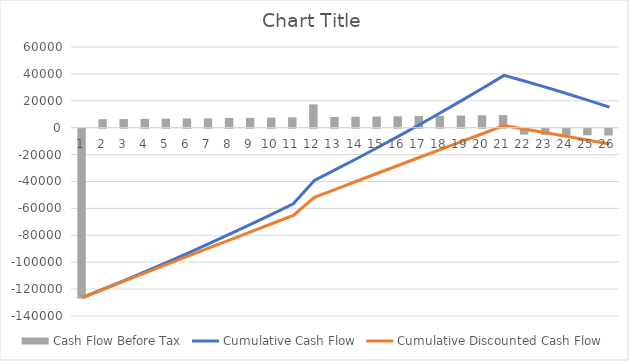
| Category | Cash Flow Before Tax |
|---|---|
| 0 | -126254.486 |
| 1 | 6322.417 |
| 2 | 6459.713 |
| 3 | 6599.611 |
| 4 | 6742.142 |
| 5 | 6887.338 |
| 6 | 7035.229 |
| 7 | 7185.846 |
| 8 | 7339.219 |
| 9 | 7495.374 |
| 10 | 7654.34 |
| 11 | 17345.469 |
| 12 | 7980.811 |
| 13 | 8148.365 |
| 14 | 8318.829 |
| 15 | 8492.224 |
| 16 | 8668.572 |
| 17 | 8847.89 |
| 18 | 9030.195 |
| 19 | 9215.503 |
| 20 | 9403.825 |
| 21 | -4409.65 |
| 22 | -4565.39 |
| 23 | -4726.843 |
| 24 | -4894.225 |
| 25 | -5067.76 |